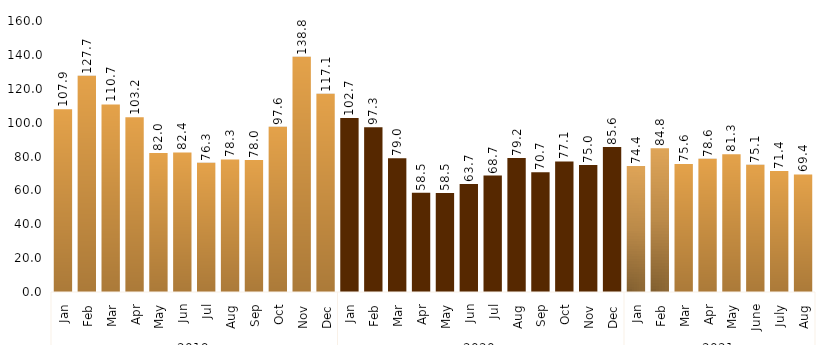
| Category | Series 0 |
|---|---|
| 0 | 107.861 |
| 1 | 127.674 |
| 2 | 110.742 |
| 3 | 103.239 |
| 4 | 82.016 |
| 5 | 82.421 |
| 6 | 76.314 |
| 7 | 78.265 |
| 8 | 77.961 |
| 9 | 97.566 |
| 10 | 138.85 |
| 11 | 117.091 |
| 12 | 102.678 |
| 13 | 97.332 |
| 14 | 78.955 |
| 15 | 58.549 |
| 16 | 58.455 |
| 17 | 63.691 |
| 18 | 68.721 |
| 19 | 79.161 |
| 20 | 70.692 |
| 21 | 77.111 |
| 22 | 74.955 |
| 23 | 85.627 |
| 24 | 74.378 |
| 25 | 84.831 |
| 26 | 75.573 |
| 27 | 78.621 |
| 28 | 81.312 |
| 29 | 75.092 |
| 30 | 71.411 |
| 31 | 69.374 |